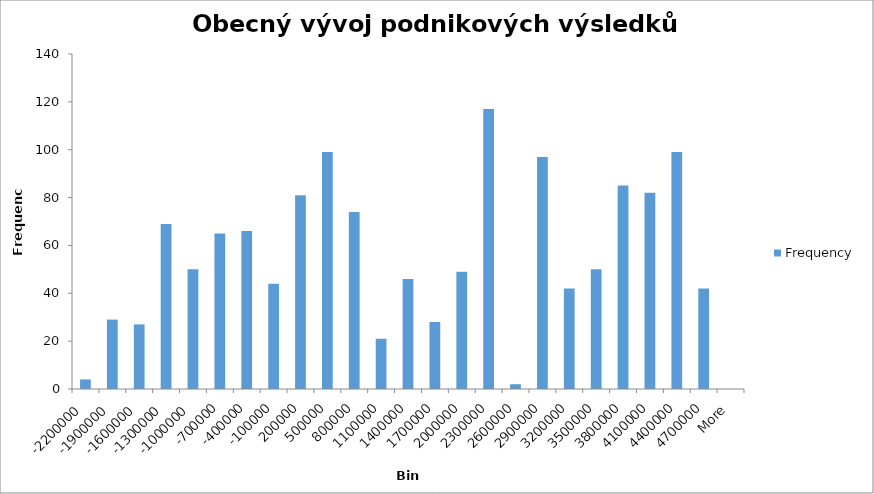
| Category | Frequency |
|---|---|
| -2200000 | 4 |
| -1900000 | 29 |
| -1600000 | 27 |
| -1300000 | 69 |
| -1000000 | 50 |
| -700000 | 65 |
| -400000 | 66 |
| -100000 | 44 |
| 200000 | 81 |
| 500000 | 99 |
| 800000 | 74 |
| 1100000 | 21 |
| 1400000 | 46 |
| 1700000 | 28 |
| 2000000 | 49 |
| 2300000 | 117 |
| 2600000 | 2 |
| 2900000 | 97 |
| 3200000 | 42 |
| 3500000 | 50 |
| 3800000 | 85 |
| 4100000 | 82 |
| 4400000 | 99 |
| 4700000 | 42 |
| More | 0 |